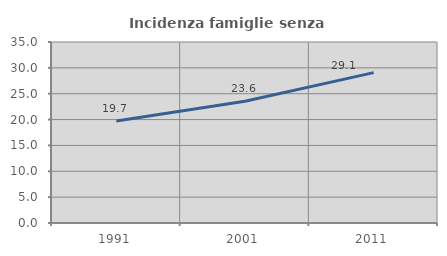
| Category | Incidenza famiglie senza nuclei |
|---|---|
| 1991.0 | 19.739 |
| 2001.0 | 23.555 |
| 2011.0 | 29.075 |